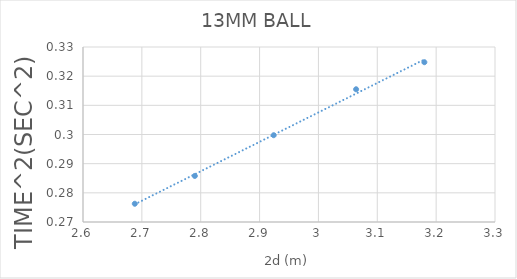
| Category | Series 0 |
|---|---|
| 3.18 | 0.325 |
| 3.064 | 0.316 |
| 2.924 | 0.3 |
| 2.79 | 0.286 |
| 2.688 | 0.276 |